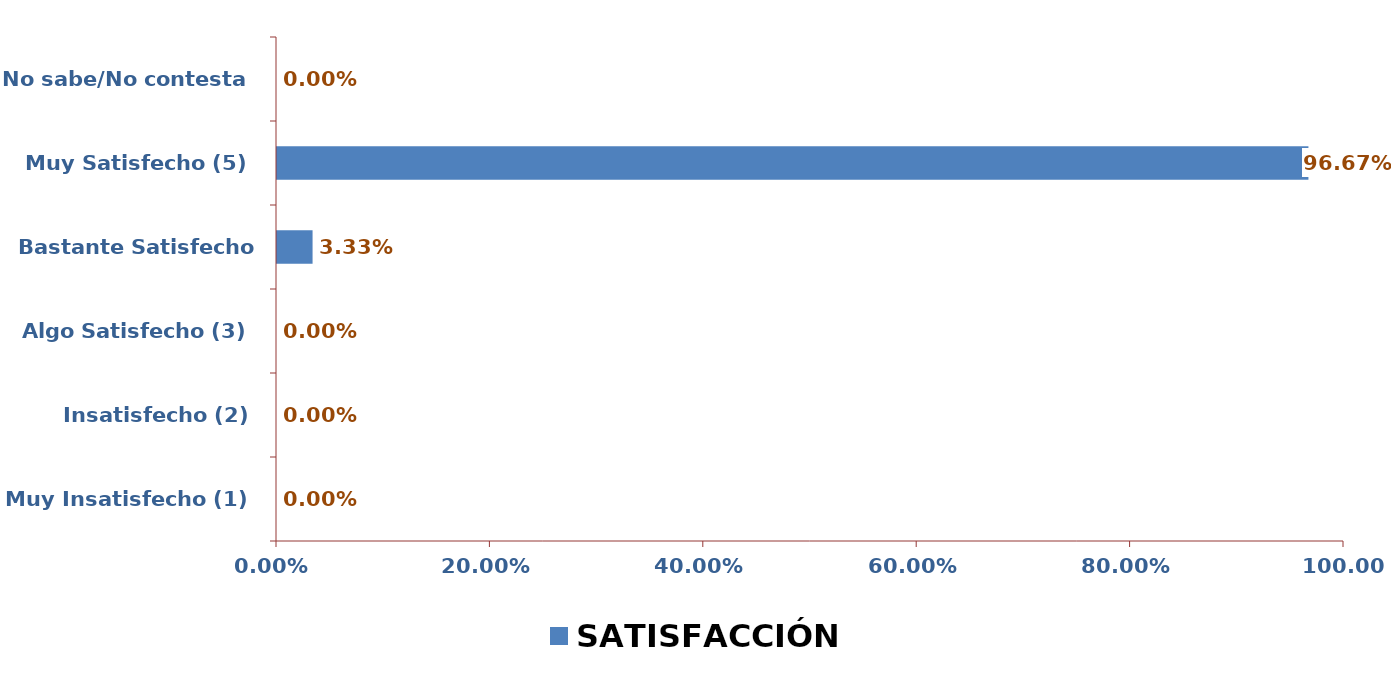
| Category | SATISFACCIÓN GLOBAL |
|---|---|
| Muy Insatisfecho (1) | 0 |
| Insatisfecho (2) | 0 |
| Algo Satisfecho (3) | 0 |
| Bastante Satisfecho (4) | 0.033 |
| Muy Satisfecho (5) | 0.967 |
| No sabe/No contesta | 0 |